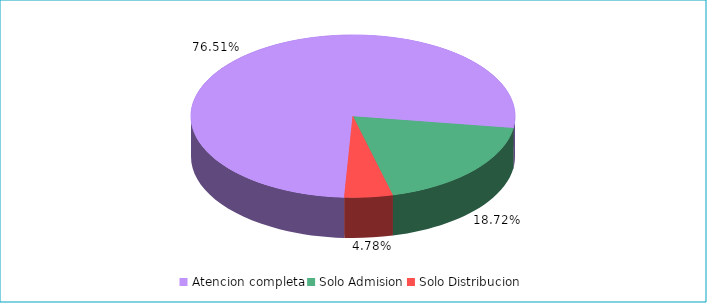
| Category | Series 0 |
|---|---|
| Atencion completa | 0.765 |
| Solo Admision | 0.187 |
| Solo Distribucion | 0.048 |